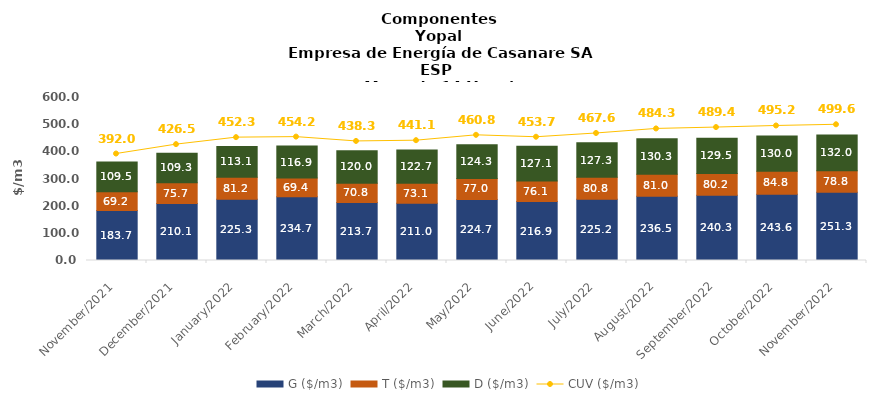
| Category | G ($/m3) | T ($/m3) | D ($/m3) |
|---|---|---|---|
| 2021-11-01 | 183.67 | 69.15 | 109.45 |
| 2021-12-01 | 210.1 | 75.73 | 109.33 |
| 2022-01-01 | 225.26 | 81.15 | 113.12 |
| 2022-02-01 | 234.71 | 69.39 | 116.94 |
| 2022-03-01 | 213.68 | 70.77 | 119.98 |
| 2022-04-01 | 210.97 | 73.14 | 122.68 |
| 2022-05-01 | 224.7 | 77.01 | 124.26 |
| 2022-06-01 | 216.91 | 76.08 | 127.14 |
| 2022-07-01 | 225.24 | 80.83 | 127.29 |
| 2022-08-01 | 236.51 | 81 | 130.34 |
| 2022-09-01 | 240.31 | 80.24 | 129.54 |
| 2022-10-01 | 243.58 | 84.76 | 129.96 |
| 2022-11-01 | 251.27 | 78.75 | 131.99 |